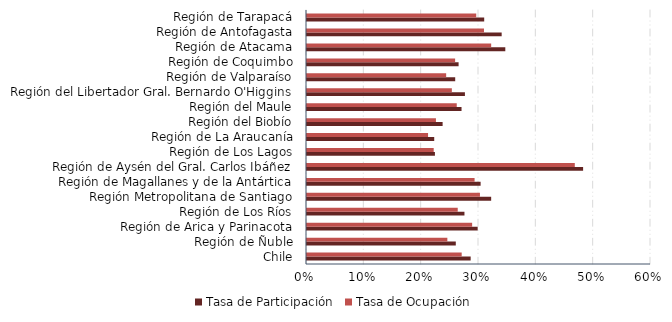
| Category | Tasa de Participación | Tasa de Ocupación |
|---|---|---|
| Chile | 0.285 | 0.27 |
| Región de Ñuble | 0.26 | 0.245 |
| Región de Arica y Parinacota | 0.298 | 0.288 |
| Región de Los Ríos | 0.275 | 0.263 |
| Región Metropolitana de Santiago | 0.321 | 0.302 |
| Región de Magallanes y de la Antártica | 0.303 | 0.292 |
| Región de Aysén del Gral. Carlos Ibáñez | 0.482 | 0.467 |
| Región de Los Lagos | 0.223 | 0.221 |
| Región de La Araucanía | 0.222 | 0.211 |
| Región del Biobío | 0.237 | 0.225 |
| Región del Maule | 0.27 | 0.261 |
| Región del Libertador Gral. Bernardo O'Higgins | 0.275 | 0.253 |
| Región de Valparaíso | 0.258 | 0.243 |
| Región de Coquimbo | 0.264 | 0.258 |
| Región de Atacama | 0.346 | 0.321 |
| Región de Antofagasta | 0.34 | 0.309 |
| Región de Tarapacá | 0.309 | 0.295 |